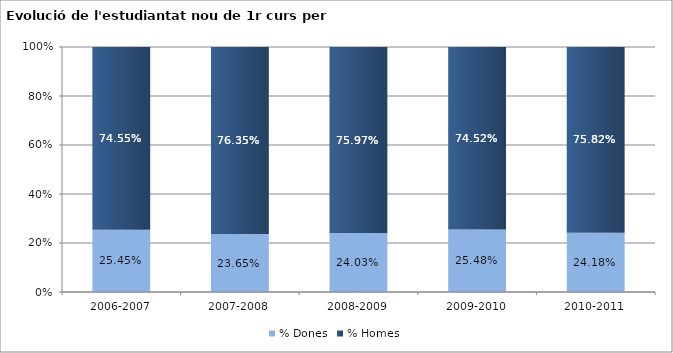
| Category | % Dones | % Homes |
|---|---|---|
| 2006-2007 | 0.255 | 0.745 |
| 2007-2008 | 0.237 | 0.763 |
| 2008-2009 | 0.24 | 0.76 |
| 2009-2010 | 0.255 | 0.745 |
| 2010-2011 | 0.242 | 0.758 |